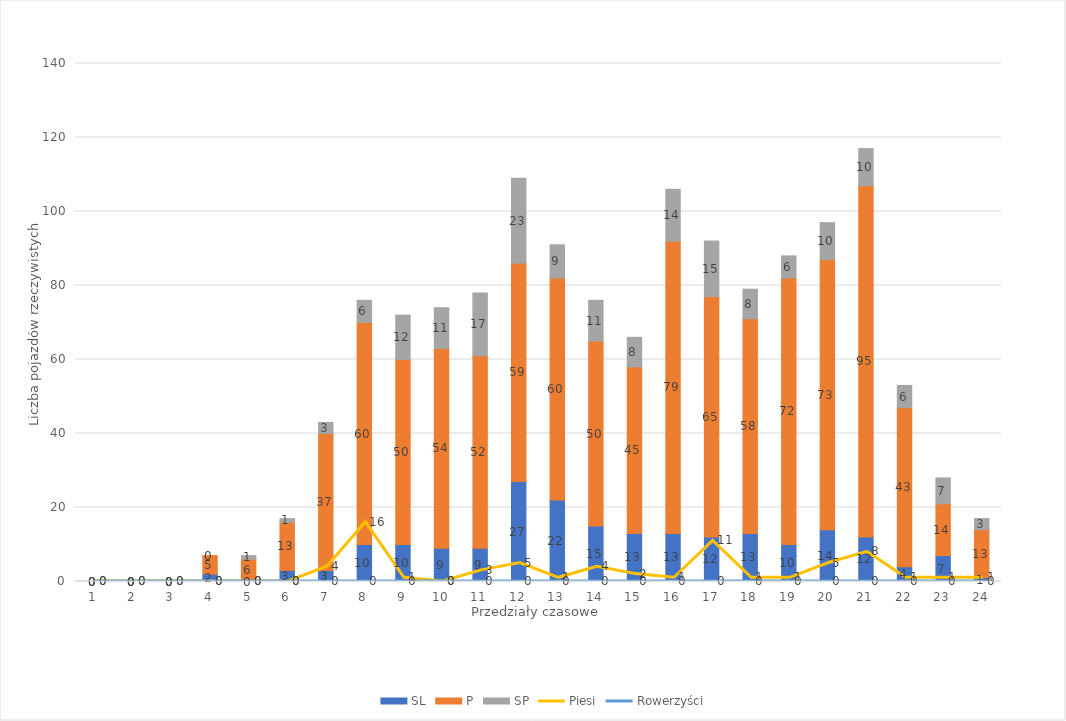
| Category | SL | P | SP |
|---|---|---|---|
| 0 | 0 | 0 | 0 |
| 1 | 0 | 0 | 0 |
| 2 | 0 | 0 | 0 |
| 3 | 2 | 5 | 0 |
| 4 | 0 | 6 | 1 |
| 5 | 3 | 13 | 1 |
| 6 | 3 | 37 | 3 |
| 7 | 10 | 60 | 6 |
| 8 | 10 | 50 | 12 |
| 9 | 9 | 54 | 11 |
| 10 | 9 | 52 | 17 |
| 11 | 27 | 59 | 23 |
| 12 | 22 | 60 | 9 |
| 13 | 15 | 50 | 11 |
| 14 | 13 | 45 | 8 |
| 15 | 13 | 79 | 14 |
| 16 | 12 | 65 | 15 |
| 17 | 13 | 58 | 8 |
| 18 | 10 | 72 | 6 |
| 19 | 14 | 73 | 10 |
| 20 | 12 | 95 | 10 |
| 21 | 4 | 43 | 6 |
| 22 | 7 | 14 | 7 |
| 23 | 1 | 13 | 3 |